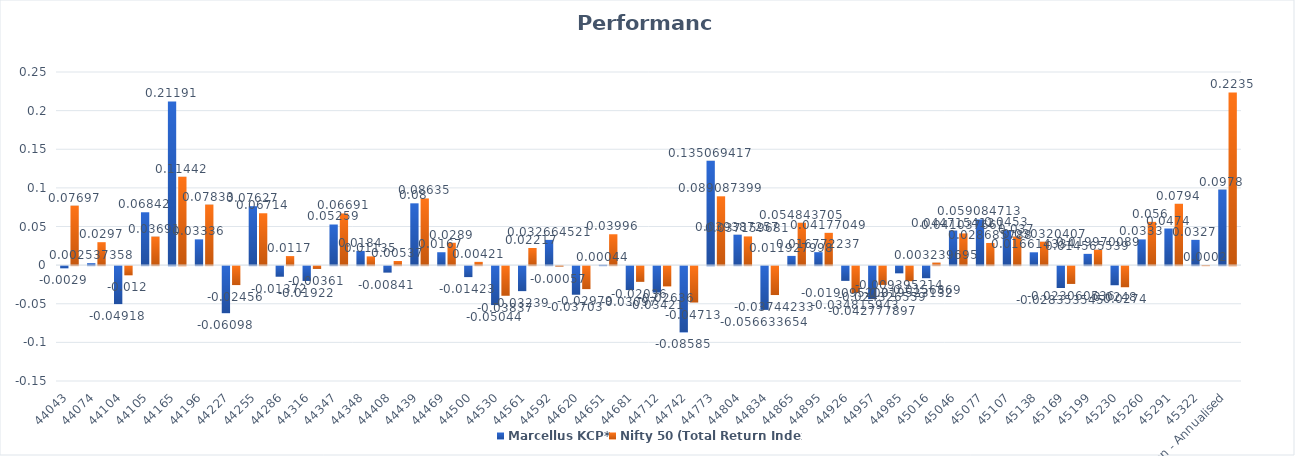
| Category | Marcellus KCP* | Nifty 50 (Total Return Index) |
|---|---|---|
| 44043 | -0.003 | 0.077 |
| 44074 | 0.003 | 0.03 |
| 44104 | -0.049 | -0.012 |
| 44105 | 0.068 | 0.037 |
| 44165 | 0.212 | 0.114 |
| 44196 | 0.033 | 0.078 |
| 44227 | -0.061 | -0.025 |
| 44255 | 0.076 | 0.067 |
| 44286 | -0.014 | 0.012 |
| 44316 | -0.019 | -0.004 |
| 44347 | 0.053 | 0.067 |
| 44348 | 0.018 | 0.011 |
| 44408 | -0.008 | 0.005 |
| 44439 | 0.08 | 0.086 |
| 44469 | 0.017 | 0.029 |
| 44500 | -0.014 | 0.004 |
| 44530 | -0.05 | -0.038 |
| 44561 | -0.032 | 0.022 |
| 44592 | 0.033 | -0.001 |
| 44620 | -0.037 | -0.03 |
| 44651 | 0 | 0.04 |
| 44681 | -0.031 | -0.02 |
| 44712 | -0.034 | -0.026 |
| 44742 | -0.086 | -0.047 |
| 44773 | 0.135 | 0.089 |
| 44804 | 0.039 | 0.037 |
| 44834 | -0.057 | -0.037 |
| 44865 | 0.012 | 0.055 |
| 44895 | 0.017 | 0.042 |
| 44926 | -0.019 | -0.035 |
| 44957 | -0.043 | -0.024 |
| 44985 | -0.009 | -0.02 |
| 45016 | -0.016 | 0.003 |
| 45046 | 0.045 | 0.041 |
| 45077 | 0.059 | 0.029 |
| 45107 | 0.045 | 0.037 |
| 45138 | 0.017 | 0.03 |
| 45169 | -0.028 | -0.023 |
| 45199 | 0.015 | 0.02 |
| 45230 | -0.025 | -0.027 |
| 45260 | 0.033 | 0.056 |
| 45291 | 0.047 | 0.079 |
| 45322 | 0.033 | 0 |
| Inception - Annualised | 0.098 | 0.224 |